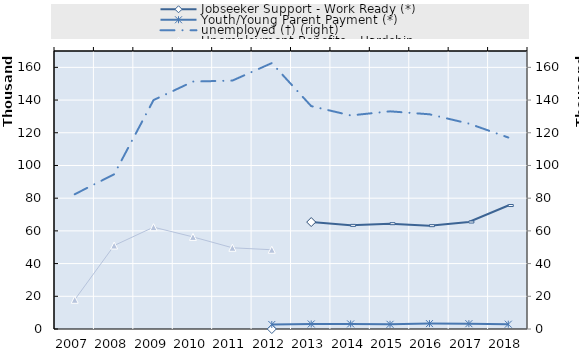
| Category | Series 4 | Series 5 | Series 6 | Series 7 | Series 8 | Series 9 | Series 10 | Series 11 | Series 12 | Series 13 | Series 14 | Series 15 | Series 16 | Series 17 | Series 18 | Series 19 | Jobseeker Support - Work Ready (*) | Youth/Young Parent Payment (*) |
|---|---|---|---|---|---|---|---|---|---|---|---|---|---|---|---|---|---|---|
| 2007.0 |  |  |  |  |  |  |  |  |  |  |  |  |  |  |  |  | 0 | 0 |
| 2008.0 |  |  |  |  |  |  |  |  |  |  |  |  |  |  |  |  | 0 | 0 |
| 2009.0 |  |  |  |  |  |  |  |  |  |  |  |  |  |  |  |  | 0 | 0 |
| 2010.0 |  |  |  |  |  |  |  |  |  |  |  |  |  |  |  |  | 0 | 0 |
| 2011.0 |  |  |  |  |  |  |  |  |  |  |  |  |  |  |  |  | 0 | 0 |
| 2012.0 |  |  |  |  |  |  |  |  |  |  |  |  |  |  |  |  | 0 | 2763 |
| 2013.0 |  |  |  |  |  |  |  |  |  |  |  |  |  |  |  |  | 65400 | 3071 |
| 2014.0 |  |  |  |  |  |  |  |  |  |  |  |  |  |  |  |  | 63371 | 3108 |
| 2015.0 |  |  |  |  |  |  |  |  |  |  |  |  |  |  |  |  | 64391 | 2871 |
| 2016.0 |  |  |  |  |  |  |  |  |  |  |  |  |  |  |  |  | 63186 | 3299 |
| 2017.0 |  |  |  |  |  |  |  |  |  |  |  |  |  |  |  |  | 65422 | 3243 |
| 2018.0 |  |  |  |  |  |  |  |  |  |  |  |  |  |  |  |  | 75504 | 2940 |